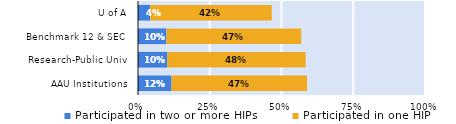
| Category | Participated in two or more HIPs | Participated in one HIP |
|---|---|---|
| AAU Institutions | 0.117 | 0.472 |
| Research-Public Univ | 0.102 | 0.482 |
| Benchmark 12 & SEC | 0.099 | 0.47 |
| U of A | 0.042 | 0.424 |